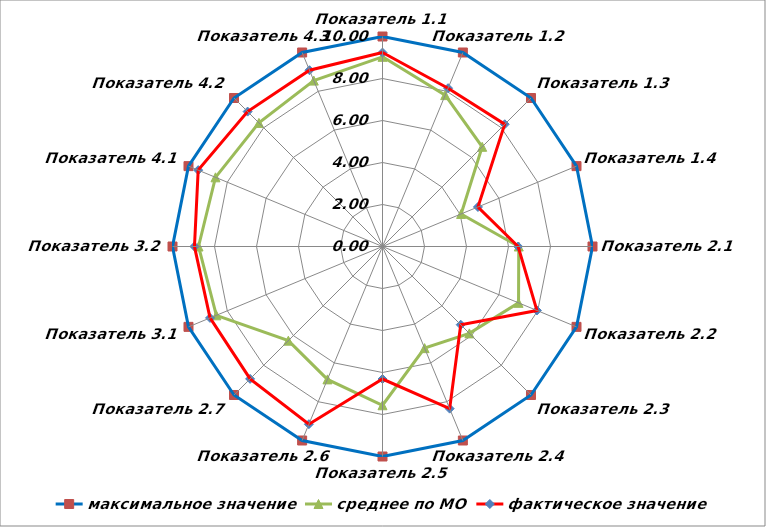
| Category | максимальное значение | среднее по МО | фактическое значение |
|---|---|---|---|
| Показатель 1.1 | 10 | 9.033 | 9.236 |
| Показатель 1.2 | 10 | 7.803 | 8.16 |
| Показатель 1.3 | 10 | 6.713 | 8.232 |
| Показатель 1.4 | 10 | 4.051 | 4.92 |
| Показатель 2.1 | 10 | 6.489 | 6.459 |
| Показатель 2.2 | 10 | 7.011 | 7.961 |
| Показатель 2.3 | 10 | 5.851 | 5.267 |
| Показатель 2.4 | 10 | 5.239 | 8.358 |
| Показатель 2.5 | 10 | 7.56 | 6.311 |
| Показатель 2.6 | 10 | 6.849 | 9.158 |
| Показатель 2.7 | 10 | 6.342 | 8.915 |
| Показатель 3.1 | 10 | 8.563 | 8.889 |
| Показатель 3.2 | 10 | 8.76 | 8.954 |
| Показатель 4.1 | 10 | 8.608 | 9.5 |
| Показатель 4.2 | 10 | 8.323 | 9.085 |
| Показатель 4.3 | 10 | 8.551 | 9.085 |